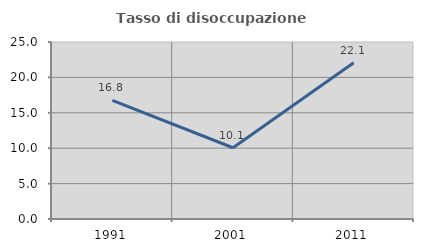
| Category | Tasso di disoccupazione giovanile  |
|---|---|
| 1991.0 | 16.756 |
| 2001.0 | 10.062 |
| 2011.0 | 22.062 |